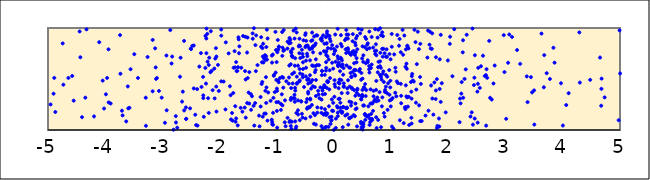
| Category | points |
|---|---|
| -1.0529040839526904 | 1.532 |
| -1.0791598197048202 | 1.056 |
| -0.5466832020468446 | 1.516 |
| 2.407446488828817 | 1.173 |
| 0.021134440096781646 | 1.936 |
| -0.9004609862997384 | 1.808 |
| 1.7097894599200854 | 1.795 |
| -0.23899677189785293 | 1.751 |
| -0.3696377647142494 | 1.428 |
| -3.556271314749057 | 1.596 |
| -2.2847006008322728 | 1.312 |
| 0.8229951050399077 | 1.028 |
| -2.3541122083491333 | 1.622 |
| 0.35149803802371143 | 1.654 |
| 69.18426641217413 | 1.924 |
| -0.6492726896510066 | 1.454 |
| 0.9849547126274313 | 1.482 |
| 2.0249144722596046 | 1.845 |
| -9.16084420562553 | 1.833 |
| -40.38873211973059 | 1.126 |
| 2.2583321104573666 | 1.316 |
| -1.3664269581176367 | 1.577 |
| 2.2320093829270014 | 1.47 |
| 2.604712514219532 | 1.728 |
| -1.6208762711169502 | 1.61 |
| -0.11272205845444029 | 1.721 |
| 0.5566662176550712 | 1.655 |
| 0.5103595259273002 | 1.24 |
| 0.11553099925634644 | 1.708 |
| -0.5331930369293354 | 1.88 |
| -2.9555463994468583 | 1.071 |
| -1.7103451973579147 | 1.666 |
| -3.2880167904921085 | 1.041 |
| -23.3667984015142 | 1.826 |
| -0.2127963657302958 | 1.538 |
| -0.13576728526768214 | 1.609 |
| -0.5984750363888608 | 1.096 |
| 0.4520226411945851 | 1.597 |
| 0.9281372252829537 | 1.36 |
| 2.2508720545938585 | 1.761 |
| -0.34806985271241364 | 1.917 |
| -1.373537784416281 | 1.833 |
| 3.0638909552609848 | 1.936 |
| -1.3611595108695418 | 1.927 |
| 1.487488157735285 | 1.242 |
| -0.9774121096201632 | 1.485 |
| -1.1897926078035148 | 1.518 |
| -2.248912372433772 | 1.608 |
| 0.8084526983788244 | 1.997 |
| -0.45054812074505884 | 1.5 |
| -0.3976961564936548 | 1.874 |
| 0.021354086045760157 | 1.78 |
| 0.47664493504224226 | 1.063 |
| -0.560639710082994 | 1.787 |
| -2.0544597197149637 | 1.181 |
| 0.8566372212816996 | 1.92 |
| -8.35208727944493 | 1.127 |
| -0.592272788281993 | 1.822 |
| 0.474523053203582 | 1.493 |
| -4.902393536681076 | 1.356 |
| 0.8433068848456542 | 1.958 |
| 0.7386482820013373 | 1.777 |
| 1.5045390370464458 | 1.52 |
| 0.8840785750827798 | 1.753 |
| 1.3059551250919492 | 1.325 |
| -0.78192890764654 | 1.632 |
| -0.48845712205889597 | 1.61 |
| 1.249867842936237 | 1.62 |
| 0.8506753874173394 | 1.551 |
| -0.7334375502179282 | 1.728 |
| -1.5547524465814915 | 1.577 |
| -0.27758153584070233 | 1.384 |
| -2.2280838179387046 | 1.994 |
| 0.47399183760723235 | 1.303 |
| 0.5683002890064075 | 1.138 |
| 0.06646352741464842 | 1.17 |
| 2.714166105821409 | 1.874 |
| -40.7210292672658 | 1.72 |
| -1.4804774244770924 | 1.568 |
| 0.3759633782361521 | 1.259 |
| -1.670531126676727 | 1.909 |
| -1.6309047185318462 | 1.217 |
| 0.6653549460630794 | 1.109 |
| 0.08115389284331428 | 1.305 |
| 0.8315678820764699 | 1.494 |
| -2.498666088329463 | 1.793 |
| 0.9251107906539566 | 1.717 |
| 24.255352770177904 | 1.531 |
| -2.0753743920331704 | 1.7 |
| 0.8624678273005547 | 1.575 |
| -0.9949236029774642 | 1.383 |
| -0.7219728909163055 | 1.796 |
| 14.440939269707643 | 1.45 |
| -0.07601738588155102 | 1.125 |
| -2.7661920694306708 | 1.136 |
| -0.6301288021079057 | 1.193 |
| -2.2155162506702855 | 1.942 |
| 1.424820596301919 | 1.861 |
| -0.41214215618204064 | 1.13 |
| 0.21492645122775933 | 1.981 |
| -3.291130035200129 | 1.316 |
| -1.3104326655507896 | 1.141 |
| -0.16675442603234858 | 1.846 |
| -6.872687071207856 | 1.882 |
| 1.3958888471734 | 1.475 |
| 0.05174061760624435 | 1.818 |
| -74.86371113299529 | 1.159 |
| 0.06931061870254905 | 1.632 |
| 0.29608974360788454 | 1.737 |
| -1.5606397224871948 | 1.22 |
| 0.5137094903340227 | 1.733 |
| -0.47059781479034307 | 1.748 |
| -9.771813936231379 | 1.077 |
| -3.9874653198274355 | 1.35 |
| 0.30478910984892776 | 1.272 |
| -0.3205477972672254 | 1.848 |
| -0.07259268712477904 | 1.896 |
| 1.3528766925399753 | 1.12 |
| 1.0242753291817182 | 1.313 |
| 0.6500108822328272 | 1.158 |
| -31.534327107097276 | 1.575 |
| 2.9675625969129604 | 1.93 |
| -25.77527238798619 | 1.964 |
| 1.5091926644851512 | 1.845 |
| 1.8075651117638485 | 1.04 |
| 0.05252894826787263 | 1.233 |
| 0.11506332727104554 | 1.22 |
| -1.6904932588358537 | 1.579 |
| -0.07635633005489678 | 1.586 |
| 0.8043035419172387 | 1.54 |
| 13.355338734594675 | 1.867 |
| 0.5119367610924764 | 1.072 |
| -0.44725169673639503 | 1.499 |
| -0.6030293477633462 | 1.895 |
| 2.2259518884536105 | 1.357 |
| 6.207228901703806 | 1.259 |
| -0.22065325102442035 | 1.902 |
| -0.18990556801960856 | 1.927 |
| 9.051371751653324 | 1.309 |
| -0.20714017502528217 | 1.578 |
| -1.244001248192774 | 1.721 |
| -0.1619095871722918 | 1.54 |
| -0.015099987147417048 | 1.187 |
| -1.0070617735653606 | 1.491 |
| 0.6377119707328175 | 1.259 |
| 0.9082149387008991 | 1.719 |
| -0.4060265825630824 | 1.466 |
| -1.1507697070627902 | 1.368 |
| 1.7543937397470184 | 1.466 |
| 0.3583740024389106 | 1.542 |
| 1.229378869239677 | 1.926 |
| 0.7154120205808311 | 1.299 |
| -1.4006669685489783 | 1.998 |
| -8.512475624037041 | 1.953 |
| -1.7377972121886223 | 1.773 |
| -0.6008671689872432 | 1.598 |
| -14.37579898268689 | 1.842 |
| 0.3954431711626829 | 1.212 |
| -0.43619239670076426 | 1.806 |
| 1.1744388668831973 | 1.335 |
| -1.0193886419781646 | 1.563 |
| 0.9197265922519904 | 1.791 |
| 0.6075226331267369 | 1.144 |
| -0.38593682803575663 | 1.799 |
| 0.16666102786564732 | 1.607 |
| 0.3571596460586256 | 1.59 |
| 0.3657397005262265 | 1.135 |
| 1.781156209693767 | 1.388 |
| -0.8457521909098843 | 1.037 |
| -0.06087065446187688 | 1.06 |
| 1.1516663603858714 | 1.096 |
| 0.6591587345763105 | 1.642 |
| -0.20171068338942524 | 1.386 |
| -1.003381311016029 | 1.666 |
| -0.09697278970498263 | 1.031 |
| 1.3601590132052335 | 1.527 |
| -0.29107409608981943 | 1.221 |
| -1.1628546061820928 | 1.092 |
| -0.5433814987870177 | 1.717 |
| -0.04303715251994227 | 1.13 |
| -1.023580870102693 | 1.962 |
| -0.7378347452914992 | 1.726 |
| 0.13199213705678303 | 1.624 |
| -0.4387157626884078 | 1.222 |
| -0.6774178854445122 | 1.387 |
| -23.98774149768738 | 1.463 |
| -1.160867533998104 | 1.898 |
| 1.4330809451312807 | 1.268 |
| -2.5162718018040753 | 1.212 |
| 3.774666477016473 | 1.5 |
| -3.7071638765974346 | 1.189 |
| -0.7561496421300586 | 1.644 |
| 3.8559719063465594 | 1.66 |
| -0.879705362427298 | 1.98 |
| 0.0133286165702545 | 1.771 |
| -0.5021423095115305 | 1.931 |
| -0.2974999103245744 | 1.636 |
| 1.644011173726946 | 1.975 |
| -0.37772461838312626 | 1.49 |
| -0.972145030114111 | 1.274 |
| 0.16250170576193906 | 1.225 |
| 1.846804749373076 | 1.402 |
| 0.7454495378341851 | 1.019 |
| -1.5111705983690356 | 1.907 |
| -0.42246685974543907 | 1.224 |
| -0.588854116020763 | 1.706 |
| 3.0100450709582796 | 1.11 |
| 1.6700386895469383 | 1.837 |
| 1.9530506962480718 | 1.173 |
| 2.6777074297138768 | 1.512 |
| -13.455516349595003 | 1.388 |
| -0.7450499876010503 | 1.011 |
| -0.004131098455282504 | 1.001 |
| -3.170843851450226 | 1.38 |
| 0.7965957641670993 | 1.372 |
| 42.065893322314295 | 1.266 |
| 0.09602801692922538 | 1.456 |
| -3.1275031437011545 | 1.801 |
| -0.41893148189569945 | 1.683 |
| -2.200708371791682 | 1.311 |
| -0.8568034157869749 | 1.291 |
| -2.8620142909781707 | 1.979 |
| -4.043437924897915 | 1.484 |
| 0.5105543239622926 | 1.031 |
| 5.276738338028273 | 1.866 |
| 5.957921870150647 | 1.21 |
| -0.7907360498943268 | 1.455 |
| -0.907482785642139 | 1.52 |
| -0.9453751905236986 | 1.509 |
| -6.802285968987222 | 1.351 |
| 4.97636698085348 | 1.096 |
| -12.202619540404708 | 1.754 |
| -0.9269882117443963 | 1.255 |
| 0.3327331466618406 | 1.758 |
| -0.11530952849105698 | 1.472 |
| 2.757500713050932 | 1.299 |
| -1.97223214268781 | 1.985 |
| 1.680172833050285 | 1.963 |
| 2.3866041851363473 | 1.132 |
| 6.15456885408203 | 1.561 |
| -1.449545272209534 | 1.198 |
| 0.49926236558425785 | 1.82 |
| -3.427564561396196 | 1.51 |
| 1.277383095717473 | 1.32 |
| -1.3937286462770684 | 1.043 |
| -2.2852232365183753 | 1.34 |
| 0.4571483989211033 | 1.948 |
| 1.1172602952562172 | 1.46 |
| -0.8336113518820187 | 1.478 |
| 2.787869028958784 | 1.456 |
| 5.849274486502921 | 1.416 |
| 0.2319722139745664 | 1.409 |
| -0.13052274816469125 | 1.847 |
| 0.43539506811189554 | 1.342 |
| -0.5605555228021742 | 1.159 |
| 1.1670000548314907 | 1.453 |
| 0.35281667730346183 | 1.391 |
| 0.7419110197314749 | 1.281 |
| -0.1615899730546206 | 1.421 |
| -0.4972980018149153 | 1.113 |
| -15.22669819193919 | 1.74 |
| 1.7768844680332407 | 1.304 |
| -1.4338710764623686 | 1.331 |
| 8.721840846029444 | 1.291 |
| 2.1952777095976543 | 1.077 |
| 0.514206556948078 | 1.054 |
| -0.4684888619045914 | 1.304 |
| -10.51049117522194 | 1.103 |
| -0.7246752805633827 | 1.715 |
| -1.0064288887237463 | 1.273 |
| -0.4686157116182997 | 1.491 |
| -4.954423748240065 | 1.25 |
| 0.29834336204582323 | 1.24 |
| -2.1388738605192423 | 1.58 |
| 2.3198710721078735 | 1.934 |
| 1.0089004010288327 | 1.941 |
| 4.289481457179582 | 1.957 |
| -0.7480020464997941 | 1.411 |
| 2.463110381985482 | 1.733 |
| 2.506623837833646 | 1.376 |
| 0.3938196508247033 | 1.663 |
| 0.7621606211979418 | 1.906 |
| 0.16107453643563988 | 1.226 |
| 1.2186946743572273 | 1.067 |
| -1.1846006382404648 | 1.265 |
| -0.6159689541116824 | 1.819 |
| 0.13419694482469777 | 1.362 |
| -0.5734460889566712 | 1.28 |
| 0.7745185630616216 | 1.983 |
| -1.1996626985855605 | 1.384 |
| 0.8424102542038933 | 1.796 |
| -11.756985241712618 | 1.356 |
| -0.06863238586396996 | 1.509 |
| 1.0398507018772956 | 1.014 |
| -0.652594227999861 | 1.956 |
| -1.0498146042157297 | 1.539 |
| 4.060117005537069 | 1.245 |
| 1.3781772366079246 | 1.485 |
| 0.8449421366816876 | 1.32 |
| 3.968396374052387 | 1.458 |
| -7.068526810686784 | 1.271 |
| -1.8198688520424244 | 1.429 |
| -0.002661460467160109 | 1.795 |
| -1.1978959834983178 | 1.688 |
| 0.40393265875936146 | 1.922 |
| 0.40224001227743117 | 1.035 |
| -1.1720576517123473 | 1.69 |
| 0.02054179825802671 | 1.424 |
| 0.5442364387760602 | 1.451 |
| -0.785106762526815 | 1.849 |
| -0.07933385388857614 | 1.923 |
| -0.37170189951478855 | 1.812 |
| -0.11650676744343096 | 1.479 |
| -7.000301745021909 | 1.211 |
| -1.2648264464680183 | 1.451 |
| 0.6184519000620777 | 1.965 |
| -0.4617628958284153 | 1.829 |
| -1.193470085743799 | 1.161 |
| -2.410334829253893 | 1.049 |
| 0.7579881593499602 | 1.318 |
| -7.385215801977048 | 1.998 |
| -0.7870485912446279 | 1.515 |
| 1.7166564124469859 | 1.947 |
| 1.1991620440991666 | 1.981 |
| -2.3157660876388997 | 1.422 |
| 0.7149289992852637 | 1.774 |
| 1.6913882983842443 | 1.799 |
| -0.46593047332975285 | 1.724 |
| 0.24183507039557064 | 1.802 |
| -1.2188039927590044 | 1.161 |
| -2.5047066112899636 | 1.798 |
| -2.451337765607331 | 1.407 |
| -0.3631830601171412 | 1.629 |
| -1.2835507957474934 | 1.324 |
| -1.6600306177757223 | 1.752 |
| -0.1401865850333914 | 1.583 |
| -14.792197425582103 | 1.851 |
| 0.4091451682802217 | 1.404 |
| 5.605501143543624 | 1.892 |
| 1.7827760898753406 | 1.713 |
| -2.8062109177316965 | 1.002 |
| 0.5371327996667641 | 1.155 |
| -1.3012683298067103 | 1.036 |
| -0.4959339810688561 | 1.948 |
| 2.282353396350913 | 1.501 |
| -0.523094140977448 | 1.421 |
| 3.1126398188797912 | 1.912 |
| -1.2597042577297002 | 1.664 |
| -0.4141207704566691 | 1.298 |
| 3.675878138292257 | 1.734 |
| 3.0433877920006274 | 1.659 |
| -2.0863804669469292 | 1.31 |
| -2.12206610267586 | 1.39 |
| 0.24973036869493226 | 1.052 |
| 0.8892227287599034 | 1.373 |
| 0.5806778960507201 | 1.836 |
| 0.22202984797623498 | 1.936 |
| 0.5479879481043077 | 1.1 |
| -2.247170361347142 | 1.923 |
| -0.013293863225855938 | 1.266 |
| -2.0286703628744487 | 1.638 |
| -9.46796304510926 | 1.283 |
| -0.6857374155084336 | 1.277 |
| -4.104136042366399 | 1.861 |
| -1.4543073437187464 | 1.352 |
| -1.7291990559535042 | 1.614 |
| 0.6222671082930283 | 1.05 |
| 1.0706409542214468 | 1.365 |
| -1.8913954986512889 | 1.859 |
| -0.38250045918018044 | 1.633 |
| 0.6454674184502402 | 1.607 |
| 0.5904441174881492 | 1.85 |
| 0.6916731340229575 | 1.33 |
| -0.11088543095262342 | 1.925 |
| -0.1275586282190417 | 1.413 |
| -0.7219840363721695 | 1.456 |
| -0.29258502121071756 | 1.927 |
| -0.4196016717625711 | 1.537 |
| 24.71045072368473 | 1.424 |
| -0.16990286374613245 | 1.44 |
| 1.3020811235304117 | 1.799 |
| 0.03400835699232162 | 1.112 |
| -0.1248485556368804 | 1.946 |
| 0.07296916243148105 | 1.626 |
| 8.364155644131577 | 1.381 |
| -2.692300435973192 | 1.522 |
| 0.16981750237754697 | 1.423 |
| 1.0732549083165543 | 1.61 |
| -0.989884767354178 | 1.763 |
| 0.21359109559254746 | 1.755 |
| -3.6043955554099036 | 1.427 |
| -0.13583885347910152 | 1.146 |
| 21.775042574950913 | 1.036 |
| 1.4387621719009678 | 1.396 |
| 0.2430233289573117 | 1.896 |
| -0.1976627861640444 | 1.015 |
| 1.0983359500626282 | 1.476 |
| 0.21878261343025782 | 1.633 |
| -1.0866380660766741 | 1.73 |
| -0.6566492396362522 | 1.167 |
| 1.5325511092448165 | 1.088 |
| 5.523343829458754 | 1.987 |
| 0.44001001151873476 | 1.579 |
| 15.256286053784446 | 1.923 |
| 1.3147041710673837 | 1.049 |
| 6.855691149310235 | 1.821 |
| -0.8114779355739582 | 1.866 |
| 0.3013231957895665 | 1.126 |
| 0.2388831149085909 | 1.363 |
| 0.7374800942228861 | 1.125 |
| 1.2722478929242356 | 1.6 |
| -2.1606057308342206 | 1.566 |
| -2.230583700941888 | 1.753 |
| 0.5263927078558966 | 1.24 |
| 2.4542518998746266 | 1.513 |
| 0.13967705317017015 | 1.168 |
| 0.6149542008083938 | 1.627 |
| -1.0809005585471991 | 1.08 |
| 3.6684483677993485 | 1.419 |
| -0.8702046876783625 | 1.784 |
| -2.9292974264233216 | 1.73 |
| 1.010033523197392 | 1.816 |
| 2.0702766352896083 | 1.527 |
| 0.6332079056673182 | 1.078 |
| -4.405103320352204 | 1.126 |
| -1.1732778675648696 | 1.984 |
| 0.8848717400076891 | 1.131 |
| 1.2669579877221961 | 1.65 |
| -1.2387805696927472 | 1.846 |
| -5.722223854599423 | 1.482 |
| -0.8885275783187045 | 1.513 |
| -2.9253864485326844 | 1.193 |
| -0.21577667798916897 | 1.894 |
| -1.6016895054119626 | 1.18 |
| -1.4224699241224878 | 1.947 |
| 8.39512398473229 | 1.931 |
| 0.8203108419723111 | 1.521 |
| 0.720056547706395 | 1.988 |
| -4.551148479656352 | 1.288 |
| 3.718147392803101 | 1.557 |
| 0.36577807192624606 | 1.735 |
| 1.797980339570909 | 1.499 |
| 2.655628121291177 | 1.538 |
| 7563.676416872083 | 1.336 |
| 0.970046105235195 | 1.744 |
| 1.7188746439404015 | 1.309 |
| -2.23782188676432 | 1.455 |
| 11.802249195762844 | 1.664 |
| -0.1611804496532904 | 1.159 |
| 1.465150102745289 | 1.964 |
| 10.676516665353985 | 1.772 |
| 0.521806527422845 | 1.419 |
| -1.1829626811816798 | 1.813 |
| 0.22666848005289378 | 1.795 |
| 1.5077021118685772 | 1.087 |
| -1.492879285394727 | 1.367 |
| -0.7556653889861228 | 1.039 |
| 26.489753812099593 | 1.399 |
| -9.610699313667299 | 1.175 |
| -2.2886810983177015 | 1.521 |
| 2.6669969055883835 | 1.596 |
| 0.34252533676690283 | 1.774 |
| -0.4518744292333666 | 1.358 |
| 2.2034609617119285 | 1.308 |
| -0.49058821006684694 | 1.825 |
| 0.152893133960879 | 1.028 |
| 0.7774159417306754 | 1.288 |
| -0.13365468826148585 | 1.773 |
| 0.3847392638255011 | 1.898 |
| 0.6841891482184485 | 1.809 |
| -4.347322269930479 | 1.317 |
| 0.2835122637836406 | 1.61 |
| 1.6514931083932423 | 1.189 |
| 1.737320979634394 | 1.151 |
| 0.3979338429097677 | 1.364 |
| -0.707604402805292 | 1.975 |
| 0.49339637066443 | 1.345 |
| -0.36604862301015667 | 1.761 |
| 1.1466082350991142 | 1.893 |
| 0.8931050536613652 | 1.393 |
| -77.05541799544477 | 1.479 |
| -0.5009082345039775 | 1.812 |
| -0.3346539912264944 | 1.42 |
| -5.017865698259749 | 1.179 |
| -4.731147674379409 | 1.444 |
| -4.8902120101422755 | 1.511 |
| 0.34289619624320705 | 1.146 |
| 0.11819358812932194 | 1.844 |
| 0.13906424872105724 | 1.681 |
| 0.9460168937795909 | 1.458 |
| 0.009679668579229124 | 1.489 |
| 1.8410184211656184 | 1.034 |
| -0.7642322374535719 | 1.885 |
| -1.1086242875520818 | 1.286 |
| -62.85140546909334 | 1.86 |
| 2.4292431042503084 | 1.053 |
| 0.9069294209067587 | 1.425 |
| 0.49759893507801106 | 1.393 |
| 1.0902348390437717 | 1.33 |
| -27.01472902140606 | 1.66 |
| -0.8116620469683989 | 1.119 |
| 2.303626460297505 | 1.594 |
| 0.6190582733589323 | 1.563 |
| 6.586098852921021 | 1.89 |
| 0.6132770672532424 | 1.595 |
| -2.18975410592333 | 1.167 |
| -0.1088828871221258 | 1.47 |
| 1.2811978618650188 | 1.826 |
| -0.21782016630320003 | 1.298 |
| -0.49146038663264013 | 1.525 |
| 0.9928944282241469 | 1.231 |
| 0.7078138929058261 | 1.288 |
| -0.45047008719705556 | 1.455 |
| -0.0327249595145972 | 1.659 |
| -0.8135934829752897 | 1.798 |
| 2.5696716915340185 | 1.625 |
| -5.253156414914892 | 1.991 |
| 5.839605768676134 | 1.91 |
| -1.0360505743202975 | 1.372 |
| 5.762167475858917 | 1.156 |
| 0.6913174035621185 | 1.384 |
| 0.6681563690265817 | 1.098 |
| -0.10757062464937613 | 1.803 |
| 5.786496913380376 | 1.613 |
| 10.778563161385332 | 1.145 |
| 0.4917698091866479 | 1.336 |
| -6.52458331226269 | 1.675 |
| 0.2632436149582787 | 1.613 |
| -0.9828559308596104 | 1.882 |
| -1.0657350114300301 | 1.168 |
| 5.020375860257463 | 1.151 |
| -0.7309296625255642 | 1.549 |
| -31.225404724341317 | 1.144 |
| -0.25387046919705525 | 1.311 |
| -1.8979370989346103 | 1.202 |
| -0.08860911774014406 | 1.233 |
| 0.11524498851013079 | 1.188 |
| 0.5445494778722854 | 1.155 |
| -1.8074230402885518 | 1.341 |
| -0.9744451964442605 | 1.789 |
| 0.8722518628485183 | 1.167 |
| 0.6587369372584574 | 1.912 |
| -3.7339852389015395 | 1.551 |
| 0.407868750978558 | 1.792 |
| 0.5896818348090118 | 1.683 |
| -12.276048411822464 | 1.703 |
| -2.392500294036741 | 1.401 |
| -7.10368917948237 | 1.563 |
| -0.12091072468469649 | 1.967 |
| -0.03346226788851321 | 1.189 |
| 0.1285457436167794 | 1.697 |
| -0.13476775413569486 | 1.736 |
| 0.4895684713742374 | 1.323 |
| 0.9759426633866476 | 1.289 |
| 0.5761155653749344 | 1.792 |
| -2.8296515604965466 | 1.72 |
| 1.5185339470941421 | 1.452 |
| -0.17712223639365168 | 1.773 |
| -1.405533111991849 | 1.237 |
| -0.31536573115409017 | 1.491 |
| 3.6274128481064003 | 1.945 |
| -0.04248641930497512 | 1.098 |
| -3.6956419297720466 | 1.143 |
| 4.002051125160621 | 1.044 |
| 1.3672794549890164 | 1.55 |
| -0.7773504890047819 | 1.902 |
| 0.822063697276933 | 1.929 |
| 0.5005914028649903 | 1.004 |
| -2.1895708016197837 | 1.637 |
| 0.33086177462270666 | 1.572 |
| -2.588961394688164 | 1.221 |
| -0.31699445170156076 | 1.693 |
| -1.929437421079376 | 1.475 |
| -1.666196917973462 | 1.889 |
| -0.45165754399365426 | 1.375 |
| -1.8419936855391772 | 1.751 |
| 1.013593849427293 | 1.034 |
| 1.0784054733466846 | 1.571 |
| 6.068393620980938 | 1.159 |
| -2.47689847276141 | 1.824 |
| 0.32878238514857 | 1.94 |
| 5.73211234322807 | 1.2 |
| 2.515672042770938 | 1.453 |
| -1.0588448898121785 | 1.315 |
| -0.2191318716405666 | 1.038 |
| -1.4201392607968224 | 1.895 |
| 0.23317160717155352 | 1.154 |
| -0.3506983474421666 | 1.061 |
| 1.4475998767031775 | 1.646 |
| -1.2233303657493753 | 1.701 |
| -15.18181907010613 | 1.63 |
| 1.2391388966597827 | 1.221 |
| 0.28997373647613367 | 1.559 |
| -2.2098865664275893 | 1.67 |
| 0.06679212488970143 | 1.136 |
| -0.7535566319282291 | 1.772 |
| -1193.2993987511825 | 1.639 |
| 0.805811202219435 | 1.625 |
| 6.642927548566765 | 1.155 |
| 0.22688731723096364 | 1.215 |
| 0.5327973607393738 | 1.411 |
| -1.7828437865181057 | 1.166 |
| 0.37850179855952487 | 1.83 |
| -3.9425178304285438 | 1.791 |
| 2.255891299747915 | 1.88 |
| 4.298185745971418 | 1.465 |
| 2.512510991664385 | 1.072 |
| 1.207967317242423 | 1.738 |
| 1.2533746873369715 | 1.225 |
| -0.48491382952977213 | 1.274 |
| -2.181347606663346 | 1.709 |
| -2.064750825906884 | 1.802 |
| 0.15014903741458197 | 1.641 |
| 0.2495759840049663 | 1.935 |
| 1.2857699552180857 | 1.819 |
| -1.5180426830589868 | 1.265 |
| -0.3830114392999579 | 1.955 |
| -0.9277781312176017 | 1.197 |
| -0.11796391337949735 | 1.162 |
| 2.420378038278972 | 1.995 |
| -1.5488772388385492 | 1.914 |
| -7.371967180080067 | 1.699 |
| -0.31587835453892665 | 1.054 |
| 0.26999142888111166 | 1.278 |
| 0.6392042020526763 | 1.399 |
| -1.3777435921057286 | 1.264 |
| -1.5196688546610777 | 1.759 |
| -0.21081272791683311 | 1.875 |
| -1.2752307825296054 | 1.817 |
| 2.213029640364576 | 1.261 |
| -0.6688989454062991 | 1.015 |
| -1.7112619455695048 | 1.113 |
| -2.7624083019097014 | 1.074 |
| 0.12132507430091853 | 1.93 |
| -4.020011072255229 | 1.21 |
| 0.27423805792889777 | 1.426 |
| 0.5620202776623547 | 1.893 |
| 0.6823968558313944 | 1.188 |
| -3.012284221233274 | 1.317 |
| 0.8376386025114213 | 1.232 |
| -0.6294105249366251 | 1.631 |
| -0.06037289953359642 | 1.87 |
| 0.564034237063329 | 1.392 |
| 0.8062191982542558 | 1.673 |
| -0.9985654008913348 | 1.187 |
| -8.207359764812285 | 1.159 |
| -17.143850086084566 | 1.604 |
| 9.672151850301086 | 1.864 |
| 0.011280985342316882 | 1.449 |
| -1.0677374011581169 | 1.74 |
| -3.966292007804753 | 1.51 |
| -0.7381266405448172 | 1.081 |
| 4.651139036886028 | 1.71 |
| 3.4975801017217645 | 1.388 |
| -0.6683344147896462 | 1.994 |
| 5.066449380420196 | 1.369 |
| -8.228979227661878 | 1.968 |
| -3.740108964434864 | 1.93 |
| 0.8647094953046897 | 1.796 |
| -2.5831125760400937 | 1.11 |
| 0.9831997770675576 | 1.418 |
| 0.7707629810992729 | 1.615 |
| 0.4817979014839671 | 1.01 |
| -0.15375611611192536 | 1.025 |
| 1.884055238848648 | 1.459 |
| 1.8486909096385866 | 1.693 |
| 2.6597453159906745 | 1.043 |
| 0.49857119994525906 | 1.504 |
| 0.48383786606334833 | 1.984 |
| 0.1372020534452127 | 1.82 |
| 12.30322218527254 | 1.413 |
| -1.5451111994385898 | 1.496 |
| -0.9060789497998947 | 1.96 |
| -0.3216611499069743 | 1.588 |
| -3.491283139703467 | 1.743 |
| 6.731181613144614 | 1.141 |
| 0.27101669679535195 | 1.115 |
| -4.742857428346671 | 1.849 |
| -1.5092433758723232 | 1.51 |
| -0.6783324228608788 | 1.084 |
| -0.0819449940261683 | 1.398 |
| 0.06272539473633942 | 1.722 |
| -0.6805575288602711 | 1.414 |
| 1.167395676128112 | 1.762 |
| -1.0143796453683278 | 1.784 |
| 5.001823750641298 | 1.554 |
| -0.9033286234902663 | 1.727 |
| 0.538177061493295 | 1.812 |
| 29.348440660558314 | 1.437 |
| 0.21056111391230503 | 1.213 |
| -0.5987970934867135 | 1.487 |
| 26.499522185968146 | 1.906 |
| -2.839833651636796 | 1.652 |
| -0.33310490021664435 | 1.566 |
| -0.5930776257315297 | 1.554 |
| -4.643343234619048 | 1.51 |
| 1.9908127631800416 | 1.682 |
| 7.304930323374503 | 1.031 |
| 1.3571022424725465 | 1.063 |
| 0.7414135323909355 | 1.732 |
| 0.1446385579352002 | 1.18 |
| 4.678295766736321 | 1.503 |
| -0.2916297238392812 | 1.17 |
| 0.3221035528486817 | 1.767 |
| 1.8004364281719358 | 1.019 |
| 1.8664992040516486 | 1.933 |
| 5.797575264626471 | 1.772 |
| -1.7709972751846275 | 1.092 |
| 3.255093789001673 | 1.649 |
| 0.2755333975529888 | 1.75 |
| -0.8848011048118739 | 1.776 |
| 2.5494385574227283 | 1.413 |
| 0.3697926881358901 | 1.533 |
| -3.259483421702018 | 1.716 |
| 0.47891689036112833 | 1.559 |
| -0.7784910339440096 | 1.079 |
| 13.941305651057492 | 1.928 |
| 0.7223117888095243 | 1.746 |
| -0.5487011649537271 | 1.544 |
| -11.190002727208258 | 1.005 |
| -0.6493800774945451 | 1.523 |
| -0.8613533268713405 | 1.075 |
| 1.248835549443103 | 1.205 |
| 0.8096415284551298 | 1.757 |
| 0.32484612800550466 | 1.871 |
| -0.2690759047107562 | 1.348 |
| -4.434489219219134 | 1.713 |
| -0.6601845477720696 | 1.033 |
| -1.9719651756627847 | 1.477 |
| 0.5475148018713117 | 1.143 |
| -1.720127143763185 | 1.081 |
| 0.5903439922521156 | 1.664 |
| 0.7726841391543817 | 1.098 |
| 1.0024807388593977 | 1.298 |
| -11.539036454263266 | 1.851 |
| -4.576363884520247 | 1.53 |
| -0.966474851940325 | 1.468 |
| -0.09279383192941612 | 1.691 |
| -3.117255893562368 | 1.613 |
| 3.46232618471743 | 1.369 |
| -0.4886081460234027 | 1.68 |
| -1.2333039214657096 | 1.662 |
| -3.939364184458549 | 1.271 |
| 0.8524384151085609 | 1.719 |
| -2.1532964729182327 | 1.968 |
| 1.3560989368826897 | 1.308 |
| -0.7497442119172668 | 1.315 |
| 0.6677118180232287 | 1.26 |
| -1.7615433928574336 | 1.362 |
| 9.171386200295993 | 1.093 |
| 0.0978371676949854 | 1.495 |
| 344.16028491718237 | 1.573 |
| -0.8862254639856592 | 1.415 |
| 0.49114849761777624 | 1.701 |
| 100.21482951006251 | 1.598 |
| -1.9706421481301595 | 1.925 |
| -0.048270119525211465 | 1.091 |
| 0.47760372592734607 | 1.299 |
| -6.089035380227361 | 1.905 |
| 0.20354815065397577 | 1.791 |
| 0.24564948505451495 | 1.789 |
| -0.5423034297875682 | 1.664 |
| -0.40024543333770374 | 1.405 |
| -0.10319409054924195 | 1.475 |
| -2.091954990516719 | 1.602 |
| 0.930687049998671 | 1.523 |
| 0.11064721678808147 | 1.267 |
| 0.19208110352238397 | 1.881 |
| -2.45140234724622 | 1.828 |
| -0.9986915386796659 | 1.406 |
| 4.731323658544819 | 1.32 |
| -0.33209307751903155 | 1.145 |
| -0.6272879525965533 | 1.152 |
| 4.101898382282155 | 1.361 |
| 0.1975898469653011 | 1.142 |
| -1.7260862972165039 | 1.233 |
| 0.17324930364424707 | 1.429 |
| -0.30827184086903997 | 1.928 |
| 0.1604411049326825 | 1.542 |
| -0.6848246659122541 | 1.63 |
| -3.0599694951431404 | 1.383 |
| 3.2007407676954447 | 1.784 |
| -0.41600483550935835 | 1.307 |
| -1.0655732658782737 | 1.051 |
| 0.08222192319859344 | 1.661 |
| 0.3102269500274023 | 1.414 |
| 4.671325435800087 | 1.238 |
| -1.0833121269024282 | 1.661 |
| 1.3446128073416763 | 1.47 |
| 0.6007126757380873 | 1.232 |
| -2.0591307599656914 | 1.426 |
| -1.180675769552148 | 1.418 |
| -0.15605087708676157 | 1.353 |
| 2.521606102049345 | 1.61 |
| 1.264976784270695 | 1.329 |
| -0.6877632693576682 | 1.311 |
| -0.9652905774033559 | 1.816 |
| -19.233586659057362 | 1.441 |
| -0.05470594780978148 | 1.799 |
| 0.817959206634712 | 1.61 |
| -0.03069967021065592 | 1.832 |
| -3.5765703257602284 | 1.218 |
| 6.091821247671095 | 1.349 |
| 1.6331503769363969 | 1.71 |
| 0.6283004823941452 | 1.11 |
| -0.03756832991251059 | 1.299 |
| 0.026893607909774467 | 1.669 |
| -2.4259305455539892 | 1.15 |
| 4.478361044078415 | 1.492 |
| -0.9007109606828724 | 1.242 |
| -3.0965520836439264 | 1.51 |
| 2.9801137663973734 | 1.568 |
| -1.3370504174793183 | 1.636 |
| 5.563335386863451 | 1.005 |
| -9.923646335965833 | 1.061 |
| 1.052440183183068 | 1.741 |
| -2.0561733557726702 | 1.72 |
| -3.904395141287708 | 1.26 |
| -3.1106888086842774 | 1.501 |
| -4.195404728917048 | 1.133 |
| -0.367046108955078 | 1.822 |
| -0.7565890239996537 | 1.295 |
| -2.6425336662484513 | 1.376 |
| 4.67531660246495 | 1.404 |
| 1.1745646977331936 | 1.262 |
| 0.08061086252311223 | 1.41 |
| -1.6778359116723187 | 1.616 |
| -1.1865059140514091 | 1.723 |
| -0.6055665300202564 | 1.753 |
| 0.871302122644591 | 1.471 |
| 0.07840937669627991 | 1.466 |
| -0.014230243966241223 | 1.602 |
| 0.9078076013831503 | 1.539 |
| 14.737895074566676 | 1.129 |
| 0.24499115445215197 | 1.488 |
| -0.3870115073912587 | 1.246 |
| 0.48315287625674025 | 1.027 |
| 0.38070070325843797 | 1.762 |
| 0.7786289972720831 | 1.669 |
| -1.6828804563396045 | 1.045 |
| 0.07361279324406383 | 1.698 |
| 3.383991914843883 | 1.273 |
| -0.709278579519772 | 1.312 |
| -0.47177810267580356 | 1.209 |
| -4.326754315797934 | 1.987 |
| 0.254262508728317 | 1.763 |
| 0.37018133430894323 | 1.854 |
| -4.4470586025568295 | 1.966 |
| -0.6089723866254413 | 1.829 |
| -0.18130918386795977 | 1.151 |
| 0.7401438219917296 | 1.481 |
| 1.3513541654894312 | 1.375 |
| 0.6805155316809773 | 1.269 |
| -0.5734136542076763 | 1.281 |
| -9.975635404357275 | 1.46 |
| 0.1209050225526151 | 1.635 |
| -0.002529230691236852 | 1.744 |
| 0.07203070525527686 | 1.642 |
| 6.673277451088473 | 1.339 |
| 2.102153036735175 | 1.988 |
| 0.5123127399590599 | 1.668 |
| 0.10569038806170586 | 1.576 |
| 0.31713329392386425 | 1.404 |
| -3.5964136010969514 | 1.212 |
| -0.3171630753844889 | 1.333 |
| -1.2820364287589603 | 1.23 |
| -1.7015426912223912 | 1.577 |
| 0.3778648763617783 | 1.204 |
| 0.3033293477475264 | 1.519 |
| -2.655901116991153 | 1.278 |
| -2.681805086954979 | 1.709 |
| 0.965960691977277 | 1.588 |
| -0.5515935720108736 | 1.746 |
| -5.398044925252533 | 1.453 |
| -2.2763214653420696 | 1.13 |
| 0.21173236550250435 | 1.897 |
| -0.22000665398441602 | 1.216 |
| -0.3778462826510903 | 1.879 |
| -1.0875826825601005 | 1.101 |
| -0.7465485548460511 | 1.759 |
| -3.17054037677625 | 1.883 |
| -0.1419745799757661 | 1.91 |
| 0.17124562053122375 | 1.457 |
| 0.9895068398313798 | 1.693 |
| 0.3947699281081338 | 1.704 |
| -0.21890213916931378 | 1.168 |
| -1.5430998582385531 | 1.121 |
| 0.37321884422770735 | 1.336 |
| 1.1072211742616174 | 1.931 |
| 0.6206015216038279 | 1.803 |
| -0.35924075814814566 | 1.165 |
| 2.0295272533813935 | 1.915 |
| -0.6057958907408857 | 1.476 |
| 0.006210004966912299 | 1.326 |
| -0.1932971132352781 | 1.413 |
| 3.4432313825887046 | 1.518 |
| 2.460261177881282 | 1.112 |
| 82.57010901699238 | 1.977 |
| 1.1369045561161795 | 1.827 |
| 0.7352370276305487 | 1.394 |
| 10.595570398224671 | 1.116 |
| -2.326571139213917 | 1.754 |
| -2.6195897553133056 | 1.192 |
| 2.6359946904339338 | 1.529 |
| -0.5414037707814545 | 1.598 |
| -0.13844666815552845 | 1.665 |
| -1.2733798120825899 | 1.91 |
| 0.1286466389211183 | 1.489 |
| -4.871234703585409 | 1.177 |
| 2.7288215130397733 | 1.316 |
| 0.4255319508279521 | 1.99 |
| 0.5444402505180203 | 1.911 |
| 0.09973160273274041 | 1.307 |
| 0.7652201263026778 | 1.565 |
| 0.5900301189248158 | 1.131 |
| 2.4460120371863816 | 1.44 |
| -1.2508606339273811 | 1.803 |
| 12.739432731032151 | 1.673 |
| 0.2263503561036498 | 1.22 |
| -11.545056891792239 | 1.428 |
| 1.2924360484143267 | 1.229 |
| -0.23212309296335243 | 1.889 |
| -0.1966875090192434 | 1.349 |
| 3.371043756629337 | 1.525 |
| 1.8344956989054964 | 1.112 |
| -0.9119329369292941 | 1.35 |
| -0.6887827100102427 | 1.897 |
| 0.4062391141156865 | 1.393 |
| 0.06520717737120726 | 1.22 |
| 0.3056628151946025 | 1.522 |
| -0.2378512775072585 | 1.418 |
| 0.37925172459411893 | 1.587 |
| 21.97676545844667 | 1.51 |
| -0.260964555656081 | 1.635 |
| 1.255871520898853 | 1.438 |
| -0.12928714613287046 | 1.851 |
| -6.975569741877749 | 1.896 |
| 7.801075856519247 | 1.75 |
| -1.8008559268192361 | 1.103 |
| -2.385956931815518 | 1.043 |
| -3.6329464673946337 | 1.084 |
| -0.6448448960602274 | 1.461 |
| 0.47000716154459604 | 1.079 |
| 0.0639596788091895 | 1.992 |
| -0.1414074338713378 | 1.168 |
| -1.2052697603261862 | 1.734 |
| -48.82254628975839 | 1.341 |
| -0.32313105577113177 | 1.626 |
| -0.4130402881528788 | 1.472 |
| 0.9694476490411038 | 1.345 |
| -1.2458334788780399 | 1.131 |
| 0.2680768945606955 | 1.117 |
| -1.589431492034257 | 1.921 |
| -7.774847379915758 | 1.992 |
| 1.2569419948174823 | 1.79 |
| 0.9366400319728659 | 1.198 |
| 0.5534952257853094 | 1.333 |
| -2.6206785541843143 | 1.874 |
| -0.4856545268412459 | 1.874 |
| -0.6304968627843598 | 1.29 |
| -1.2539556690164346 | 1.471 |
| 5.711155422472189 | 1.299 |
| -2.014419376267182 | 1.383 |
| -0.5491252291455521 | 1.121 |
| -0.6903816729211909 | 1.345 |
| 1.8656464380957256 | 1.276 |
| -1.755013863276554 | 1.61 |
| 35.32868468202684 | 1.351 |
| 1.406460451377111 | 1.983 |
| -0.42415511695865415 | 1.792 |
| -1.4813727113282258 | 1.26 |
| 3.8362884150059413 | 1.806 |
| -0.14331807891572776 | 1.762 |
| -0.3346879227450353 | 1.83 |
| 18.570239178015967 | 1.989 |
| -0.9616185229928421 | 1.817 |
| 19.953810114979994 | 1.037 |
| -1.6541777433743976 | 1.82 |
| -0.6781558558953672 | 1.704 |
| 3.502205213039981 | 1.053 |
| 4.9925786605677525 | 1.977 |
| -0.1391124239462298 | 1.03 |
| -0.2105940681980625 | 1.58 |
| -0.6970338276789699 | 1.563 |
| 2.8097225642384527 | 1.632 |
| -0.9939394533651104 | 1.023 |
| 225.54150762521598 | 1.301 |
| 1.6975615761018905 | 1.436 |
| 1.484903421313339 | 1.793 |
| -2.7408955465034475 | 1.022 |
| -0.7671923241758479 | 1.09 |
| 0.7328201149198958 | 1.84 |
| -0.759439852380417 | 1.853 |
| -0.4594744977920532 | 1.22 |
| -2.232213532962459 | 1.897 |
| 1.5999543997885346 | 1.141 |
| -72.26527834881371 | 1.69 |
| -2.585804330069654 | 1.108 |
| 0.03156464131138338 | 1.021 |
| -0.1575161846762064 | 1.203 |